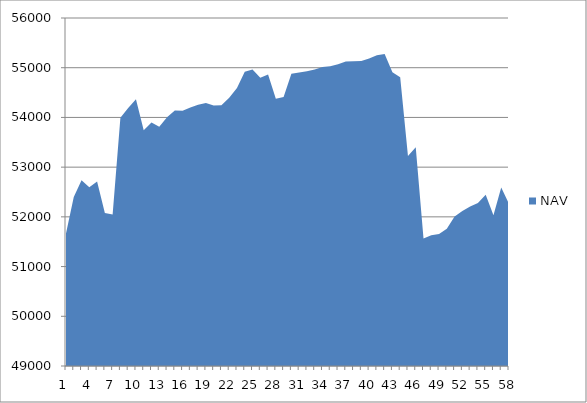
| Category | NAV |
|---|---|
| 0 | 51667 |
| 1 | 52397 |
| 2 | 52733.957 |
| 3 | 52597.875 |
| 4 | 52708.772 |
| 5 | 52075.184 |
| 6 | 52046.775 |
| 7 | 53991.219 |
| 8 | 54189.909 |
| 9 | 54364.909 |
| 10 | 53739.909 |
| 11 | 53899.542 |
| 12 | 53812.294 |
| 13 | 54003.961 |
| 14 | 54140.037 |
| 15 | 54132.37 |
| 16 | 54197.37 |
| 17 | 54255.812 |
| 18 | 54292.622 |
| 19 | 54240.699 |
| 20 | 54246.834 |
| 21 | 54397.391 |
| 22 | 54592.197 |
| 23 | 54920.119 |
| 24 | 54963.245 |
| 25 | 54796.799 |
| 26 | 54863.963 |
| 27 | 54375.975 |
| 28 | 54409.015 |
| 29 | 54878.402 |
| 30 | 54905.151 |
| 31 | 54927.958 |
| 32 | 54964.157 |
| 33 | 55012.385 |
| 34 | 55031.616 |
| 35 | 55070.791 |
| 36 | 55126.461 |
| 37 | 55131.71 |
| 38 | 55133.391 |
| 39 | 55184.783 |
| 40 | 55249.119 |
| 41 | 55278.196 |
| 42 | 54909.993 |
| 43 | 54807.052 |
| 44 | 53224.092 |
| 45 | 53401.214 |
| 46 | 51567.133 |
| 47 | 51627.536 |
| 48 | 51656.382 |
| 49 | 51762.295 |
| 50 | 52007.329 |
| 51 | 52120.149 |
| 52 | 52206.26 |
| 53 | 52279.944 |
| 54 | 52443.406 |
| 55 | 52034.315 |
| 56 | 52592.093 |
| 57 | 52259.795 |